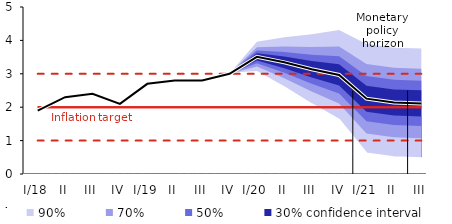
| Category | Inflation Target | Inflation Target - lower bound | Inflation Target - upper bound | linka | Střed předpovědi |
|---|---|---|---|---|---|
| I/18 | 2 | 1 | 3 | 1.9 | 1.9 |
| II | 2 | 1 | 3 | 2.3 | 2.3 |
| III | 2 | 1 | 3 | 2.4 | 2.4 |
| IV | 2 | 1 | 3 | 2.1 | 2.1 |
| I/19 | 2 | 1 | 3 | 2.7 | 2.7 |
| II | 2 | 1 | 3 | 2.8 | 2.8 |
| III | 2 | 1 | 3 | 2.8 | 2.8 |
| IV | 2 | 1 | 3 | 3 | 3 |
| I/20 | 2 | 1 | 3 | 3.506 | 3.506 |
| II | 2 | 1 | 3 | 3.343 | 3.343 |
| III | 2 | 1 | 3 | 3.135 | 3.135 |
| IV | 2 | 1 | 3 | 2.966 | 2.966 |
| I/21 | 2 | 1 | 3 | 2.256 | 2.256 |
| II | 2 | 1 | 3 | 2.144 | 2.144 |
| III | 2 | 1 | 3 | 2.114 | 2.114 |